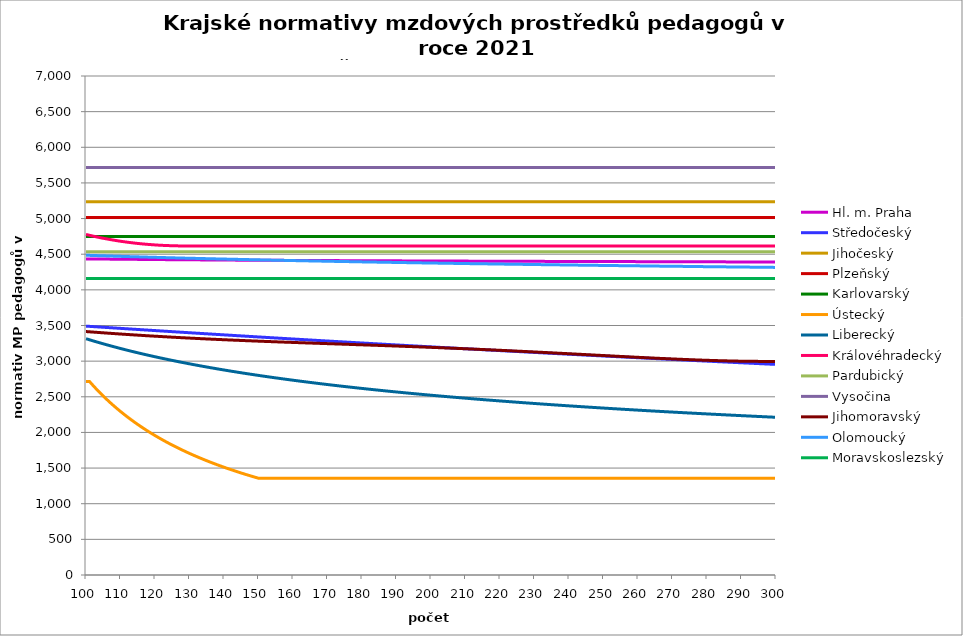
| Category | Hl. m. Praha | Středočeský | Jihočeský | Plzeňský | Karlovarský  | Ústecký   | Liberecký | Královéhradecký | Pardubický | Vysočina | Jihomoravský | Olomoucký | Moravskoslezský |
|---|---|---|---|---|---|---|---|---|---|---|---|---|---|
| 100.0 | 4434.066 | 3491.182 | 5236.605 | 5014.043 | 4750 | 2715.2 | 3314.841 | 4777.643 | 4533.328 | 5714.684 | 3415.264 | 4485.431 | 4159.138 |
| 101.0 | 4433.631 | 3488.011 | 5236.605 | 5014.043 | 4750 | 2715.2 | 3299.949 | 4765.772 | 4533.328 | 5714.684 | 3411.586 | 4483.979 | 4159.138 |
| 102.0 | 4433.196 | 3484.846 | 5236.605 | 5014.043 | 4750 | 2660.917 | 3285.335 | 4754.432 | 4533.328 | 5714.684 | 3407.915 | 4482.045 | 4159.138 |
| 103.0 | 4432.761 | 3481.686 | 5236.605 | 5014.043 | 4750 | 2608.762 | 3270.99 | 4743.615 | 4533.328 | 5714.684 | 3404.514 | 4480.595 | 4159.138 |
| 104.0 | 4432.326 | 3478.533 | 5236.605 | 5014.043 | 4750 | 2558.613 | 3256.907 | 4733.314 | 4533.328 | 5714.684 | 3400.859 | 4479.146 | 4159.138 |
| 105.0 | 4431.892 | 3475.385 | 5236.605 | 5014.043 | 4750 | 2510.355 | 3243.078 | 4723.522 | 4533.328 | 5714.684 | 3397.472 | 4477.699 | 4159.138 |
| 106.0 | 4431.457 | 3472.242 | 5236.605 | 5014.043 | 4750 | 2463.735 | 3229.495 | 4714.699 | 4533.328 | 5714.684 | 3393.832 | 4476.252 | 4159.138 |
| 107.0 | 4431.023 | 3469.106 | 5236.605 | 5014.043 | 4750 | 2418.958 | 3216.152 | 4705.908 | 4533.328 | 5714.684 | 3390.459 | 4474.806 | 4159.138 |
| 108.0 | 4430.588 | 3465.975 | 5236.605 | 5014.043 | 4750 | 2375.78 | 3203.041 | 4697.61 | 4533.328 | 5714.684 | 3387.092 | 4472.88 | 4159.138 |
| 109.0 | 4430.154 | 3462.849 | 5236.605 | 5014.043 | 4750 | 2334.117 | 3190.155 | 4689.341 | 4533.328 | 5714.684 | 3383.733 | 4471.436 | 4159.138 |
| 110.0 | 4429.72 | 3459.73 | 5236.605 | 5014.043 | 4750 | 2293.889 | 3177.489 | 4682.015 | 4533.328 | 5714.684 | 3380.38 | 4469.994 | 4159.138 |
| 111.0 | 4429.286 | 3456.616 | 5236.605 | 5014.043 | 4750 | 2255.025 | 3165.037 | 4675.168 | 4533.328 | 5714.684 | 3377.29 | 4468.552 | 4159.138 |
| 112.0 | 4428.851 | 3453.507 | 5236.605 | 5014.043 | 4750 | 2217.455 | 3152.792 | 4668.341 | 4533.328 | 5714.684 | 3373.95 | 4467.111 | 4159.138 |
| 113.0 | 4428.417 | 3450.404 | 5236.605 | 5014.043 | 4750 | 2181.117 | 3140.749 | 4662.44 | 4533.328 | 5714.684 | 3370.873 | 4465.671 | 4159.138 |
| 114.0 | 4427.984 | 3447.307 | 5236.605 | 5014.043 | 4750 | 2145.838 | 3128.903 | 4656.555 | 4533.328 | 5714.684 | 3367.801 | 4464.232 | 4159.138 |
| 115.0 | 4427.55 | 3444.215 | 5236.605 | 5014.043 | 4750 | 2111.791 | 3117.248 | 4651.135 | 4533.328 | 5714.684 | 3364.734 | 4463.273 | 4159.138 |
| 116.0 | 4427.116 | 3441.129 | 5236.605 | 5014.043 | 4750 | 2078.808 | 3105.78 | 4646.178 | 4533.328 | 5714.684 | 3361.674 | 4461.836 | 4159.138 |
| 117.0 | 4426.682 | 3438.048 | 5236.605 | 5014.043 | 4750 | 2046.839 | 3094.493 | 4641.68 | 4533.328 | 5714.684 | 3358.619 | 4460.399 | 4159.138 |
| 118.0 | 4426.249 | 3434.973 | 5236.605 | 5014.043 | 4750 | 2015.838 | 3083.382 | 4637.64 | 4533.328 | 5714.684 | 3355.569 | 4458.964 | 4159.138 |
| 119.0 | 4425.815 | 3431.903 | 5236.605 | 5014.043 | 4750 | 1985.763 | 3072.444 | 4634.055 | 4533.328 | 5714.684 | 3352.778 | 4457.529 | 4159.138 |
| 120.0 | 4425.382 | 3428.839 | 5236.605 | 5014.043 | 4750 | 1956.572 | 3061.674 | 4630.475 | 4533.328 | 5714.684 | 3349.992 | 4456.095 | 4159.138 |
| 121.0 | 4424.949 | 3425.781 | 5236.605 | 5014.043 | 4750 | 1928.226 | 3051.067 | 4627.347 | 4533.328 | 5714.684 | 3347.211 | 4455.14 | 4159.138 |
| 122.0 | 4424.515 | 3422.727 | 5236.605 | 5014.043 | 4750 | 1900.602 | 3040.62 | 4624.67 | 4533.328 | 5714.684 | 3344.434 | 4453.708 | 4159.138 |
| 123.0 | 4424.082 | 3419.679 | 5236.605 | 5014.043 | 4750 | 1873.844 | 3030.329 | 4622.441 | 4533.328 | 5714.684 | 3341.662 | 4452.276 | 4159.138 |
| 124.0 | 4424.082 | 3416.637 | 5236.605 | 5014.043 | 4750 | 1847.829 | 3020.19 | 4620.659 | 4533.328 | 5714.684 | 3338.895 | 4450.846 | 4159.138 |
| 125.0 | 4423.649 | 3413.6 | 5236.605 | 5014.043 | 4750 | 1822.527 | 3010.199 | 4618.879 | 4533.328 | 5714.684 | 3336.132 | 4449.893 | 4159.138 |
| 126.0 | 4423.216 | 3410.568 | 5236.605 | 5014.043 | 4750 | 1797.908 | 3000.352 | 4617.545 | 4533.328 | 5714.684 | 3333.624 | 4448.464 | 4159.138 |
| 127.0 | 4422.783 | 3407.542 | 5236.605 | 5014.043 | 4750 | 1773.945 | 2990.647 | 4616.655 | 4533.328 | 5714.684 | 3330.87 | 4447.036 | 4159.138 |
| 128.0 | 4422.351 | 3404.521 | 5236.605 | 5014.043 | 4750 | 1750.613 | 2981.08 | 4616.211 | 4533.328 | 5714.684 | 3328.37 | 4446.085 | 4159.138 |
| 129.0 | 4421.918 | 3401.506 | 5236.605 | 5014.043 | 4750 | 1727.886 | 2971.648 | 4615.767 | 4533.328 | 5714.684 | 3325.874 | 4444.658 | 4159.138 |
| 130.0 | 4421.485 | 3398.496 | 5236.605 | 5014.043 | 4750 | 1705.67 | 2962.347 | 4615.767 | 4533.328 | 5714.684 | 3323.381 | 4443.708 | 4159.138 |
| 131.0 | 4421.485 | 3395.491 | 5236.605 | 5014.043 | 4750 | 1684.089 | 2953.175 | 4615.767 | 4533.328 | 5714.684 | 3320.893 | 4442.283 | 4159.138 |
| 132.0 | 4421.053 | 3392.491 | 5236.605 | 5014.043 | 4750 | 1663.046 | 2944.129 | 4615.767 | 4533.328 | 5714.684 | 3318.656 | 4441.334 | 4159.138 |
| 133.0 | 4420.62 | 3389.497 | 5236.605 | 5014.043 | 4750 | 1642.523 | 2935.206 | 4615.767 | 4533.328 | 5714.684 | 3316.174 | 4439.91 | 4159.138 |
| 134.0 | 4420.188 | 3386.508 | 5236.605 | 5014.043 | 4750 | 1622.5 | 2926.402 | 4615.767 | 4533.328 | 5714.684 | 3313.944 | 4438.962 | 4159.138 |
| 135.0 | 4419.756 | 3383.524 | 5236.605 | 5014.043 | 4750 | 1602.96 | 2917.717 | 4615.767 | 4533.328 | 5714.684 | 3311.47 | 4437.54 | 4159.138 |
| 136.0 | 4419.756 | 3380.546 | 5236.605 | 5014.043 | 4750 | 1583.884 | 2909.146 | 4615.767 | 4533.328 | 5714.684 | 3309.246 | 4436.593 | 4159.138 |
| 137.0 | 4419.323 | 3377.573 | 5236.605 | 5014.043 | 4750 | 1565.257 | 2900.688 | 4615.767 | 4533.328 | 5714.684 | 3307.025 | 4435.172 | 4159.138 |
| 138.0 | 4418.891 | 3374.605 | 5236.605 | 5014.043 | 4750 | 1547.005 | 2892.339 | 4615.767 | 4533.328 | 5714.684 | 3304.807 | 4434.226 | 4159.138 |
| 139.0 | 4418.459 | 3371.642 | 5236.605 | 5014.043 | 4750 | 1529.231 | 2884.099 | 4615.767 | 4533.328 | 5714.684 | 3302.592 | 4432.807 | 4159.138 |
| 140.0 | 4418.027 | 3368.684 | 5236.605 | 5014.043 | 4750 | 1511.86 | 2875.963 | 4615.767 | 4533.328 | 5714.684 | 3300.625 | 4431.862 | 4159.138 |
| 141.0 | 4418.027 | 3365.732 | 5236.605 | 5014.043 | 4750 | 1494.88 | 2867.931 | 4615.767 | 4533.328 | 5714.684 | 3298.416 | 4430.917 | 4159.138 |
| 142.0 | 4417.595 | 3362.785 | 5236.605 | 5014.043 | 4750 | 1478.277 | 2860 | 4615.767 | 4533.328 | 5714.684 | 3296.209 | 4429.5 | 4159.138 |
| 143.0 | 4417.164 | 3359.843 | 5236.605 | 5014.043 | 4750 | 1462.038 | 2852.168 | 4615.767 | 4533.328 | 5714.684 | 3294.25 | 4428.556 | 4159.138 |
| 144.0 | 4416.732 | 3356.906 | 5236.605 | 5014.043 | 4750 | 1446.153 | 2844.433 | 4615.767 | 4533.328 | 5714.684 | 3292.294 | 4427.613 | 4159.138 |
| 145.0 | 4416.732 | 3353.974 | 5236.605 | 5014.043 | 4750 | 1430.609 | 2836.793 | 4615.767 | 4533.328 | 5714.684 | 3290.096 | 4426.198 | 4159.138 |
| 146.0 | 4416.3 | 3351.047 | 5236.605 | 5014.043 | 4750 | 1415.346 | 2829.246 | 4615.767 | 4533.328 | 5714.684 | 3288.144 | 4425.256 | 4159.138 |
| 147.0 | 4415.869 | 3348.126 | 5236.605 | 5014.043 | 4750 | 1400.454 | 2821.79 | 4615.767 | 4533.328 | 5714.684 | 3286.195 | 4424.313 | 4159.138 |
| 148.0 | 4415.437 | 3345.209 | 5236.605 | 5014.043 | 4750 | 1385.872 | 2814.423 | 4615.767 | 4533.328 | 5714.684 | 3284.248 | 4423.372 | 4159.138 |
| 149.0 | 4415.437 | 3342.298 | 5236.605 | 5014.043 | 4750 | 1371.59 | 2807.144 | 4615.767 | 4533.328 | 5714.684 | 3282.303 | 4421.96 | 4159.138 |
| 150.0 | 4415.006 | 3339.391 | 5236.605 | 5014.043 | 4750 | 1357.6 | 2799.951 | 4615.767 | 4533.328 | 5714.684 | 3280.361 | 4421.019 | 4159.138 |
| 151.0 | 4415.006 | 3336.49 | 5236.605 | 5014.043 | 4750 | 1357.6 | 2792.842 | 4615.767 | 4533.328 | 5714.684 | 3278.421 | 4420.079 | 4159.138 |
| 152.0 | 4414.575 | 3333.594 | 5236.605 | 5014.043 | 4750 | 1357.6 | 2785.815 | 4615.767 | 4533.328 | 5714.684 | 3276.725 | 4419.139 | 4159.138 |
| 153.0 | 4414.575 | 3330.703 | 5236.605 | 5014.043 | 4750 | 1357.6 | 2778.87 | 4615.767 | 4533.328 | 5714.684 | 3274.79 | 4417.73 | 4159.138 |
| 154.0 | 4414.143 | 3327.816 | 5236.605 | 5014.043 | 4750 | 1357.6 | 2772.004 | 4615.767 | 4533.328 | 5714.684 | 3273.098 | 4416.791 | 4159.138 |
| 155.0 | 4414.143 | 3324.935 | 5236.605 | 5014.043 | 4750 | 1357.6 | 2765.216 | 4615.767 | 4533.328 | 5714.684 | 3271.166 | 4415.852 | 4159.138 |
| 156.0 | 4413.712 | 3322.059 | 5236.605 | 5014.043 | 4750 | 1357.6 | 2758.504 | 4615.767 | 4533.328 | 5714.684 | 3269.478 | 4414.914 | 4159.138 |
| 157.0 | 4413.712 | 3319.188 | 5236.605 | 5014.043 | 4750 | 1357.6 | 2751.868 | 4615.767 | 4533.328 | 5714.684 | 3267.551 | 4413.976 | 4159.138 |
| 158.0 | 4413.281 | 3316.321 | 5236.605 | 5014.043 | 4750 | 1357.6 | 2745.305 | 4615.767 | 4533.328 | 5714.684 | 3265.866 | 4413.039 | 4159.138 |
| 159.0 | 4413.281 | 3313.46 | 5236.605 | 5014.043 | 4750 | 1357.6 | 2738.815 | 4615.767 | 4533.328 | 5714.684 | 3264.184 | 4412.102 | 4159.138 |
| 160.0 | 4412.85 | 3310.603 | 5236.605 | 5014.043 | 4750 | 1357.6 | 2732.395 | 4615.767 | 4533.328 | 5714.684 | 3262.263 | 4411.165 | 4159.138 |
| 161.0 | 4412.85 | 3307.752 | 5236.605 | 5014.043 | 4750 | 1357.6 | 2726.046 | 4615.767 | 4533.328 | 5714.684 | 3260.584 | 4409.761 | 4159.138 |
| 162.0 | 4412.419 | 3304.905 | 5236.605 | 5014.043 | 4750 | 1357.6 | 2719.764 | 4615.767 | 4533.328 | 5714.684 | 3258.907 | 4408.826 | 4159.138 |
| 163.0 | 4412.419 | 3302.064 | 5236.605 | 5014.043 | 4750 | 1357.6 | 2713.55 | 4615.767 | 4533.328 | 5714.684 | 3257.231 | 4407.891 | 4159.138 |
| 164.0 | 4411.989 | 3299.227 | 5236.605 | 5014.043 | 4750 | 1357.6 | 2707.403 | 4615.767 | 4533.328 | 5714.684 | 3255.557 | 4406.956 | 4159.138 |
| 165.0 | 4411.989 | 3296.395 | 5236.605 | 5014.043 | 4750 | 1357.6 | 2701.32 | 4615.767 | 4533.328 | 5714.684 | 3253.885 | 4406.021 | 4159.138 |
| 166.0 | 4411.558 | 3293.568 | 5236.605 | 5014.043 | 4750 | 1357.6 | 2695.301 | 4615.767 | 4533.328 | 5714.684 | 3252.215 | 4405.087 | 4159.138 |
| 167.0 | 4411.558 | 3290.746 | 5236.605 | 5014.043 | 4750 | 1357.6 | 2689.344 | 4615.767 | 4533.328 | 5714.684 | 3250.546 | 4404.154 | 4159.138 |
| 168.0 | 4411.127 | 3287.928 | 5236.605 | 5014.043 | 4750 | 1357.6 | 2683.449 | 4615.767 | 4533.328 | 5714.684 | 3248.879 | 4403.221 | 4159.138 |
| 169.0 | 4411.127 | 3285.115 | 5236.605 | 5014.043 | 4750 | 1357.6 | 2677.615 | 4615.767 | 4533.328 | 5714.684 | 3247.214 | 4402.288 | 4159.138 |
| 170.0 | 4410.697 | 3282.308 | 5236.605 | 5014.043 | 4750 | 1357.6 | 2671.84 | 4615.767 | 4533.328 | 5714.684 | 3245.55 | 4401.356 | 4159.138 |
| 171.0 | 4410.697 | 3279.505 | 5236.605 | 5014.043 | 4750 | 1357.6 | 2666.124 | 4615.767 | 4533.328 | 5714.684 | 3243.889 | 4400.424 | 4159.138 |
| 172.0 | 4410.266 | 3276.706 | 5236.605 | 5014.043 | 4750 | 1357.6 | 2660.465 | 4615.767 | 4533.328 | 5714.684 | 3242.228 | 4399.492 | 4159.138 |
| 173.0 | 4410.266 | 3273.913 | 5236.605 | 5014.043 | 4750 | 1357.6 | 2654.863 | 4615.767 | 4533.328 | 5714.684 | 3240.57 | 4399.026 | 4159.138 |
| 174.0 | 4409.836 | 3271.124 | 5236.605 | 5014.043 | 4750 | 1357.6 | 2649.316 | 4615.767 | 4533.328 | 5714.684 | 3238.913 | 4398.095 | 4159.138 |
| 175.0 | 4409.836 | 3268.34 | 5236.605 | 5014.043 | 4750 | 1357.6 | 2643.824 | 4615.767 | 4533.328 | 5714.684 | 3237.258 | 4397.165 | 4159.138 |
| 176.0 | 4409.406 | 3265.561 | 5236.605 | 5014.043 | 4750 | 1357.6 | 2638.386 | 4615.767 | 4533.328 | 5714.684 | 3235.605 | 4396.234 | 4159.138 |
| 177.0 | 4409.406 | 3262.787 | 5236.605 | 5014.043 | 4750 | 1357.6 | 2633.001 | 4615.767 | 4533.328 | 5714.684 | 3233.717 | 4395.305 | 4159.138 |
| 178.0 | 4408.976 | 3260.017 | 5236.605 | 5014.043 | 4750 | 1357.6 | 2627.668 | 4615.767 | 4533.328 | 5714.684 | 3232.068 | 4394.375 | 4159.138 |
| 179.0 | 4408.976 | 3257.252 | 5236.605 | 5014.043 | 4750 | 1357.6 | 2622.386 | 4615.767 | 4533.328 | 5714.684 | 3230.42 | 4393.446 | 4159.138 |
| 180.0 | 4408.546 | 3254.492 | 5236.605 | 5014.043 | 4750 | 1357.6 | 2617.155 | 4615.767 | 4533.328 | 5714.684 | 3228.773 | 4392.517 | 4159.138 |
| 181.0 | 4408.546 | 3251.736 | 5236.605 | 5014.043 | 4750 | 1357.6 | 2611.973 | 4615.767 | 4533.328 | 5714.684 | 3227.129 | 4391.589 | 4159.138 |
| 182.0 | 4408.546 | 3248.985 | 5236.605 | 5014.043 | 4750 | 1357.6 | 2606.841 | 4615.767 | 4533.328 | 5714.684 | 3225.485 | 4391.125 | 4159.138 |
| 183.0 | 4408.115 | 3246.238 | 5236.605 | 5014.043 | 4750 | 1357.6 | 2601.756 | 4615.767 | 4533.328 | 5714.684 | 3223.844 | 4390.198 | 4159.138 |
| 184.0 | 4408.115 | 3243.497 | 5236.605 | 5014.043 | 4750 | 1357.6 | 2596.718 | 4615.767 | 4533.328 | 5714.684 | 3222.204 | 4389.27 | 4159.138 |
| 185.0 | 4407.686 | 3240.759 | 5236.605 | 5014.043 | 4750 | 1357.6 | 2591.728 | 4615.767 | 4533.328 | 5714.684 | 3220.333 | 4388.343 | 4159.138 |
| 186.0 | 4407.686 | 3238.027 | 5236.605 | 5014.043 | 4750 | 1357.6 | 2586.783 | 4615.767 | 4533.328 | 5714.684 | 3218.696 | 4387.417 | 4159.138 |
| 187.0 | 4407.256 | 3235.299 | 5236.605 | 5014.043 | 4750 | 1357.6 | 2581.883 | 4615.767 | 4533.328 | 5714.684 | 3217.062 | 4386.954 | 4159.138 |
| 188.0 | 4407.256 | 3232.576 | 5236.605 | 5014.043 | 4750 | 1357.6 | 2577.028 | 4615.767 | 4533.328 | 5714.684 | 3215.196 | 4386.028 | 4159.138 |
| 189.0 | 4406.826 | 3229.857 | 5236.605 | 5014.043 | 4750 | 1357.6 | 2572.217 | 4615.767 | 4533.328 | 5714.684 | 3213.565 | 4385.102 | 4159.138 |
| 190.0 | 4406.826 | 3227.143 | 5236.605 | 5014.043 | 4750 | 1357.6 | 2567.449 | 4615.767 | 4533.328 | 5714.684 | 3211.703 | 4384.177 | 4159.138 |
| 191.0 | 4406.826 | 3224.433 | 5236.605 | 5014.043 | 4750 | 1357.6 | 2562.723 | 4615.767 | 4533.328 | 5714.684 | 3210.076 | 4383.715 | 4159.138 |
| 192.0 | 4406.396 | 3221.728 | 5236.605 | 5014.043 | 4750 | 1357.6 | 2558.039 | 4615.767 | 4533.328 | 5714.684 | 3208.218 | 4382.79 | 4159.138 |
| 193.0 | 4406.396 | 3219.028 | 5236.605 | 5014.043 | 4750 | 1357.6 | 2553.397 | 4615.767 | 4533.328 | 5714.684 | 3206.363 | 4381.866 | 4159.138 |
| 194.0 | 4405.967 | 3216.332 | 5236.605 | 5014.043 | 4750 | 1357.6 | 2548.795 | 4615.767 | 4533.328 | 5714.684 | 3204.741 | 4380.942 | 4159.138 |
| 195.0 | 4405.967 | 3213.64 | 5236.605 | 5014.043 | 4750 | 1357.6 | 2544.233 | 4615.767 | 4533.328 | 5714.684 | 3202.889 | 4380.481 | 4159.138 |
| 196.0 | 4405.537 | 3210.953 | 5236.605 | 5014.043 | 4750 | 1357.6 | 2539.711 | 4615.767 | 4533.328 | 5714.684 | 3201.039 | 4379.557 | 4159.138 |
| 197.0 | 4405.537 | 3208.271 | 5236.605 | 5014.043 | 4750 | 1357.6 | 2535.228 | 4615.767 | 4533.328 | 5714.684 | 3199.192 | 4378.635 | 4159.138 |
| 198.0 | 4405.537 | 3205.593 | 5236.605 | 5014.043 | 4750 | 1357.6 | 2530.783 | 4615.767 | 4533.328 | 5714.684 | 3197.347 | 4378.173 | 4159.138 |
| 199.0 | 4405.108 | 3202.919 | 5236.605 | 5014.043 | 4750 | 1357.6 | 2526.376 | 4615.767 | 4533.328 | 5714.684 | 3195.504 | 4377.251 | 4159.138 |
| 200.0 | 4405.108 | 3200.25 | 5236.605 | 5014.043 | 4750 | 1357.6 | 2522.007 | 4615.767 | 4533.328 | 5714.684 | 3193.663 | 4376.329 | 4159.138 |
| 201.0 | 4404.678 | 3197.585 | 5236.605 | 5014.043 | 4750 | 1357.6 | 2517.674 | 4615.767 | 4533.328 | 5714.684 | 3191.594 | 4375.869 | 4159.138 |
| 202.0 | 4404.678 | 3194.925 | 5236.605 | 5014.043 | 4750 | 1357.6 | 2513.377 | 4615.767 | 4533.328 | 5714.684 | 3189.758 | 4374.947 | 4159.138 |
| 203.0 | 4404.678 | 3192.269 | 5236.605 | 5014.043 | 4750 | 1357.6 | 2509.116 | 4615.767 | 4533.328 | 5714.684 | 3187.694 | 4374.027 | 4159.138 |
| 204.0 | 4404.249 | 3189.618 | 5236.605 | 5014.043 | 4750 | 1357.6 | 2504.89 | 4615.767 | 4533.328 | 5714.684 | 3185.862 | 4373.566 | 4159.138 |
| 205.0 | 4404.249 | 3186.971 | 5236.605 | 5014.043 | 4750 | 1357.6 | 2500.7 | 4615.767 | 4533.328 | 5714.684 | 3183.804 | 4372.646 | 4159.138 |
| 206.0 | 4403.82 | 3184.328 | 5236.605 | 5014.043 | 4750 | 1357.6 | 2496.543 | 4615.767 | 4533.328 | 5714.684 | 3181.976 | 4371.726 | 4159.138 |
| 207.0 | 4403.82 | 3181.69 | 5236.605 | 5014.043 | 4750 | 1357.6 | 2492.42 | 4615.767 | 4533.328 | 5714.684 | 3179.923 | 4371.266 | 4159.138 |
| 208.0 | 4403.82 | 3179.056 | 5236.605 | 5014.043 | 4750 | 1357.6 | 2488.331 | 4615.767 | 4533.328 | 5714.684 | 3177.872 | 4370.347 | 4159.138 |
| 209.0 | 4403.391 | 3176.427 | 5236.605 | 5014.043 | 4750 | 1357.6 | 2484.274 | 4615.767 | 4533.328 | 5714.684 | 3175.824 | 4369.887 | 4159.138 |
| 210.0 | 4403.391 | 3173.802 | 5236.605 | 5014.043 | 4750 | 1357.6 | 2480.25 | 4615.767 | 4533.328 | 5714.684 | 3173.778 | 4368.969 | 4159.138 |
| 211.0 | 4402.962 | 3171.181 | 5236.605 | 5014.043 | 4750 | 1357.6 | 2476.258 | 4615.767 | 4533.328 | 5714.684 | 3171.735 | 4368.05 | 4159.138 |
| 212.0 | 4402.962 | 3168.564 | 5236.605 | 5014.043 | 4750 | 1357.6 | 2472.298 | 4615.767 | 4533.328 | 5714.684 | 3169.468 | 4367.591 | 4159.138 |
| 213.0 | 4402.962 | 3165.952 | 5236.605 | 5014.043 | 4750 | 1357.6 | 2468.369 | 4615.767 | 4533.328 | 5714.684 | 3167.431 | 4366.674 | 4159.138 |
| 214.0 | 4402.533 | 3163.344 | 5236.605 | 5014.043 | 4750 | 1357.6 | 2464.47 | 4615.767 | 4533.328 | 5714.684 | 3165.396 | 4366.215 | 4159.138 |
| 215.0 | 4402.533 | 3160.741 | 5236.605 | 5014.043 | 4750 | 1357.6 | 2460.602 | 4615.767 | 4533.328 | 5714.684 | 3163.138 | 4365.298 | 4159.138 |
| 216.0 | 4402.104 | 3158.141 | 5236.605 | 5014.043 | 4750 | 1357.6 | 2456.764 | 4615.767 | 4533.328 | 5714.684 | 3160.884 | 4364.839 | 4159.138 |
| 217.0 | 4402.104 | 3155.546 | 5236.605 | 5014.043 | 4750 | 1357.6 | 2452.956 | 4615.767 | 4533.328 | 5714.684 | 3158.857 | 4363.923 | 4159.138 |
| 218.0 | 4402.104 | 3152.956 | 5236.605 | 5014.043 | 4750 | 1357.6 | 2449.177 | 4615.767 | 4533.328 | 5714.684 | 3156.609 | 4363.465 | 4159.138 |
| 219.0 | 4401.675 | 3150.369 | 5236.605 | 5014.043 | 4750 | 1357.6 | 2445.426 | 4615.767 | 4533.328 | 5714.684 | 3154.364 | 4362.549 | 4159.138 |
| 220.0 | 4401.675 | 3147.787 | 5236.605 | 5014.043 | 4750 | 1357.6 | 2441.705 | 4615.767 | 4533.328 | 5714.684 | 3152.122 | 4361.633 | 4159.138 |
| 221.0 | 4401.675 | 3145.209 | 5236.605 | 5014.043 | 4750 | 1357.6 | 2438.011 | 4615.767 | 4533.328 | 5714.684 | 3149.883 | 4361.175 | 4159.138 |
| 222.0 | 4401.247 | 3142.635 | 5236.605 | 5014.043 | 4750 | 1357.6 | 2434.345 | 4615.767 | 4533.328 | 5714.684 | 3147.647 | 4360.26 | 4159.138 |
| 223.0 | 4401.247 | 3140.065 | 5236.605 | 5014.043 | 4750 | 1357.6 | 2430.706 | 4615.767 | 4533.328 | 5714.684 | 3145.191 | 4359.803 | 4159.138 |
| 224.0 | 4400.818 | 3137.5 | 5236.605 | 5014.043 | 4750 | 1357.6 | 2427.095 | 4615.767 | 4533.328 | 5714.684 | 3142.962 | 4358.888 | 4159.138 |
| 225.0 | 4400.818 | 3134.939 | 5236.605 | 5014.043 | 4750 | 1357.6 | 2423.51 | 4615.767 | 4533.328 | 5714.684 | 3140.514 | 4358.431 | 4159.138 |
| 226.0 | 4400.818 | 3132.382 | 5236.605 | 5014.043 | 4750 | 1357.6 | 2419.951 | 4615.767 | 4533.328 | 5714.684 | 3138.292 | 4357.974 | 4159.138 |
| 227.0 | 4400.389 | 3129.829 | 5236.605 | 5014.043 | 4750 | 1357.6 | 2416.419 | 4615.767 | 4533.328 | 5714.684 | 3135.851 | 4357.06 | 4159.138 |
| 228.0 | 4400.389 | 3127.28 | 5236.605 | 5014.043 | 4750 | 1357.6 | 2412.913 | 4615.767 | 4533.328 | 5714.684 | 3133.413 | 4356.604 | 4159.138 |
| 229.0 | 4400.389 | 3124.736 | 5236.605 | 5014.043 | 4750 | 1357.6 | 2409.431 | 4615.767 | 4533.328 | 5714.684 | 3131.201 | 4355.691 | 4159.138 |
| 230.0 | 4399.961 | 3122.195 | 5236.605 | 5014.043 | 4750 | 1357.6 | 2405.975 | 4615.767 | 4533.328 | 5714.684 | 3128.771 | 4355.234 | 4159.138 |
| 231.0 | 4399.961 | 3119.659 | 5236.605 | 5014.043 | 4750 | 1357.6 | 2402.544 | 4615.767 | 4533.328 | 5714.684 | 3126.345 | 4354.322 | 4159.138 |
| 232.0 | 4399.961 | 3117.127 | 5236.605 | 5014.043 | 4750 | 1357.6 | 2399.138 | 4615.767 | 4533.328 | 5714.684 | 3123.922 | 4353.865 | 4159.138 |
| 233.0 | 4399.533 | 3114.599 | 5236.605 | 5014.043 | 4750 | 1357.6 | 2395.755 | 4615.767 | 4533.328 | 5714.684 | 3121.503 | 4352.953 | 4159.138 |
| 234.0 | 4399.533 | 3112.075 | 5236.605 | 5014.043 | 4750 | 1357.6 | 2392.397 | 4615.767 | 4533.328 | 5714.684 | 3118.869 | 4352.498 | 4159.138 |
| 235.0 | 4399.533 | 3109.555 | 5236.605 | 5014.043 | 4750 | 1357.6 | 2389.062 | 4615.767 | 4533.328 | 5714.684 | 3116.458 | 4352.042 | 4159.138 |
| 236.0 | 4399.104 | 3107.039 | 5236.605 | 5014.043 | 4750 | 1357.6 | 2385.751 | 4615.767 | 4533.328 | 5714.684 | 3114.051 | 4351.131 | 4159.138 |
| 237.0 | 4399.104 | 3104.527 | 5236.605 | 5014.043 | 4750 | 1357.6 | 2382.462 | 4615.767 | 4533.328 | 5714.684 | 3111.429 | 4350.675 | 4159.138 |
| 238.0 | 4398.676 | 3102.019 | 5236.605 | 5014.043 | 4750 | 1357.6 | 2379.197 | 4615.767 | 4533.328 | 5714.684 | 3109.03 | 4349.765 | 4159.138 |
| 239.0 | 4398.676 | 3099.516 | 5236.605 | 5014.043 | 4750 | 1357.6 | 2375.954 | 4615.767 | 4533.328 | 5714.684 | 3106.416 | 4349.309 | 4159.138 |
| 240.0 | 4398.676 | 3097.016 | 5236.605 | 5014.043 | 4750 | 1357.6 | 2372.734 | 4615.767 | 4533.328 | 5714.684 | 3104.025 | 4348.399 | 4159.138 |
| 241.0 | 4398.248 | 3094.521 | 5236.605 | 5014.043 | 4750 | 1357.6 | 2369.535 | 4615.767 | 4533.328 | 5714.684 | 3101.42 | 4347.944 | 4159.138 |
| 242.0 | 4398.248 | 3092.029 | 5236.605 | 5014.043 | 4750 | 1357.6 | 2366.358 | 4615.767 | 4533.328 | 5714.684 | 3098.819 | 4347.49 | 4159.138 |
| 243.0 | 4398.248 | 3089.541 | 5236.605 | 5014.043 | 4750 | 1357.6 | 2363.203 | 4615.767 | 4533.328 | 5714.684 | 3096.439 | 4346.58 | 4159.138 |
| 244.0 | 4397.82 | 3087.058 | 5236.605 | 5014.043 | 4750 | 1357.6 | 2360.069 | 4615.767 | 4533.328 | 5714.684 | 3093.847 | 4346.126 | 4159.138 |
| 245.0 | 4397.82 | 3084.578 | 5236.605 | 5014.043 | 4750 | 1357.6 | 2356.957 | 4615.767 | 4533.328 | 5714.684 | 3091.259 | 4345.671 | 4159.138 |
| 246.0 | 4397.82 | 3082.103 | 5236.605 | 5014.043 | 4750 | 1357.6 | 2353.865 | 4615.767 | 4533.328 | 5714.684 | 3088.675 | 4344.763 | 4159.138 |
| 247.0 | 4397.392 | 3079.631 | 5236.605 | 5014.043 | 4750 | 1357.6 | 2350.793 | 4615.767 | 4533.328 | 5714.684 | 3086.096 | 4344.309 | 4159.138 |
| 248.0 | 4397.392 | 3077.163 | 5236.605 | 5014.043 | 4750 | 1357.6 | 2347.742 | 4615.767 | 4533.328 | 5714.684 | 3083.521 | 4343.855 | 4159.138 |
| 249.0 | 4397.392 | 3074.7 | 5236.605 | 5014.043 | 4750 | 1357.6 | 2344.712 | 4615.767 | 4533.328 | 5714.684 | 3081.164 | 4342.947 | 4159.138 |
| 250.0 | 4396.964 | 3072.24 | 5236.605 | 5014.043 | 4750 | 1357.6 | 2341.701 | 4615.767 | 4533.328 | 5714.684 | 3078.598 | 4342.493 | 4159.138 |
| 251.0 | 4396.964 | 3069.784 | 5236.605 | 5014.043 | 4750 | 1357.6 | 2338.709 | 4615.767 | 4533.328 | 5714.684 | 3076.035 | 4342.039 | 4159.138 |
| 252.0 | 4396.964 | 3067.332 | 5236.605 | 5014.043 | 4750 | 1357.6 | 2335.738 | 4615.767 | 4533.328 | 5714.684 | 3073.477 | 4341.132 | 4159.138 |
| 253.0 | 4396.537 | 3064.884 | 5236.605 | 5014.043 | 4750 | 1357.6 | 2332.785 | 4615.767 | 4533.328 | 5714.684 | 3070.923 | 4340.679 | 4159.138 |
| 254.0 | 4396.537 | 3062.44 | 5236.605 | 5014.043 | 4750 | 1357.6 | 2329.852 | 4615.767 | 4533.328 | 5714.684 | 3068.373 | 4340.226 | 4159.138 |
| 255.0 | 4396.537 | 3060 | 5236.605 | 5014.043 | 4750 | 1357.6 | 2326.937 | 4615.767 | 4533.328 | 5714.684 | 3066.04 | 4339.319 | 4159.138 |
| 256.0 | 4396.109 | 3057.564 | 5236.605 | 5014.043 | 4750 | 1357.6 | 2324.041 | 4615.767 | 4533.328 | 5714.684 | 3063.498 | 4338.866 | 4159.138 |
| 257.0 | 4396.109 | 3055.131 | 5236.605 | 5014.043 | 4750 | 1357.6 | 2321.164 | 4615.767 | 4533.328 | 5714.684 | 3060.961 | 4338.413 | 4159.138 |
| 258.0 | 4396.109 | 3052.703 | 5236.605 | 5014.043 | 4750 | 1357.6 | 2318.305 | 4615.767 | 4533.328 | 5714.684 | 3058.428 | 4337.508 | 4159.138 |
| 259.0 | 4396.109 | 3050.278 | 5236.605 | 5014.043 | 4750 | 1357.6 | 2315.463 | 4615.767 | 4533.328 | 5714.684 | 3056.109 | 4337.055 | 4159.138 |
| 260.0 | 4395.681 | 3047.857 | 5236.605 | 5014.043 | 4750 | 1357.6 | 2312.64 | 4615.767 | 4533.328 | 5714.684 | 3053.584 | 4336.603 | 4159.138 |
| 261.0 | 4395.681 | 3045.44 | 5236.605 | 5014.043 | 4750 | 1357.6 | 2309.834 | 4615.767 | 4533.328 | 5714.684 | 3051.273 | 4336.15 | 4159.138 |
| 262.0 | 4395.681 | 3043.027 | 5236.605 | 5014.043 | 4750 | 1357.6 | 2307.046 | 4615.767 | 4533.328 | 5714.684 | 3048.756 | 4335.246 | 4159.138 |
| 263.0 | 4395.254 | 3040.618 | 5236.605 | 5014.043 | 4750 | 1357.6 | 2304.276 | 4615.767 | 4533.328 | 5714.684 | 3046.452 | 4334.793 | 4159.138 |
| 264.0 | 4395.254 | 3038.212 | 5236.605 | 5014.043 | 4750 | 1357.6 | 2301.522 | 4615.767 | 4533.328 | 5714.684 | 3044.152 | 4334.341 | 4159.138 |
| 265.0 | 4395.254 | 3035.81 | 5236.605 | 5014.043 | 4750 | 1357.6 | 2298.785 | 4615.767 | 4533.328 | 5714.684 | 3041.855 | 4333.438 | 4159.138 |
| 266.0 | 4394.826 | 3033.412 | 5236.605 | 5014.043 | 4750 | 1357.6 | 2296.065 | 4615.767 | 4533.328 | 5714.684 | 3039.561 | 4332.986 | 4159.138 |
| 267.0 | 4394.826 | 3031.018 | 5236.605 | 5014.043 | 4750 | 1357.6 | 2293.362 | 4615.767 | 4533.328 | 5714.684 | 3037.271 | 4332.534 | 4159.138 |
| 268.0 | 4394.826 | 3028.628 | 5236.605 | 5014.043 | 4750 | 1357.6 | 2290.675 | 4615.767 | 4533.328 | 5714.684 | 3035.193 | 4332.083 | 4159.138 |
| 269.0 | 4394.399 | 3026.241 | 5236.605 | 5014.043 | 4750 | 1357.6 | 2288.004 | 4615.767 | 4533.328 | 5714.684 | 3032.909 | 4331.631 | 4159.138 |
| 270.0 | 4394.399 | 3023.858 | 5236.605 | 5014.043 | 4750 | 1357.6 | 2285.349 | 4615.767 | 4533.328 | 5714.684 | 3030.837 | 4330.728 | 4159.138 |
| 271.0 | 4394.399 | 3021.479 | 5236.605 | 5014.043 | 4750 | 1357.6 | 2282.711 | 4615.767 | 4533.328 | 5714.684 | 3028.767 | 4330.277 | 4159.138 |
| 272.0 | 4393.972 | 3019.104 | 5236.605 | 5014.043 | 4750 | 1357.6 | 2280.088 | 4615.767 | 4533.328 | 5714.684 | 3026.699 | 4329.826 | 4159.138 |
| 273.0 | 4393.972 | 3016.732 | 5236.605 | 5014.043 | 4750 | 1357.6 | 2277.481 | 4615.767 | 4533.328 | 5714.684 | 3024.635 | 4329.375 | 4159.138 |
| 274.0 | 4393.972 | 3014.364 | 5236.605 | 5014.043 | 4750 | 1357.6 | 2274.889 | 4615.767 | 4533.328 | 5714.684 | 3022.574 | 4328.473 | 4159.138 |
| 275.0 | 4393.972 | 3012 | 5236.605 | 5014.043 | 4750 | 1357.6 | 2272.312 | 4615.767 | 4533.328 | 5714.684 | 3020.721 | 4328.022 | 4159.138 |
| 276.0 | 4393.545 | 3009.639 | 5236.605 | 5014.043 | 4750 | 1357.6 | 2269.751 | 4615.767 | 4533.328 | 5714.684 | 3018.87 | 4327.572 | 4159.138 |
| 277.0 | 4393.545 | 3007.283 | 5236.605 | 5014.043 | 4750 | 1357.6 | 2267.204 | 4615.767 | 4533.328 | 5714.684 | 3017.022 | 4327.121 | 4159.138 |
| 278.0 | 4393.545 | 3004.93 | 5236.605 | 5014.043 | 4750 | 1357.6 | 2264.673 | 4615.767 | 4533.328 | 5714.684 | 3015.175 | 4326.671 | 4159.138 |
| 279.0 | 4393.118 | 3002.58 | 5236.605 | 5014.043 | 4750 | 1357.6 | 2262.156 | 4615.767 | 4533.328 | 5714.684 | 3013.536 | 4325.77 | 4159.138 |
| 280.0 | 4393.118 | 3000.234 | 5236.605 | 5014.043 | 4750 | 1357.6 | 2259.654 | 4615.767 | 4533.328 | 5714.684 | 3011.899 | 4325.32 | 4159.138 |
| 281.0 | 4393.118 | 2997.892 | 5236.605 | 5014.043 | 4750 | 1357.6 | 2257.166 | 4615.767 | 4533.328 | 5714.684 | 3010.263 | 4324.87 | 4159.138 |
| 282.0 | 4393.118 | 2995.554 | 5236.605 | 5014.043 | 4750 | 1357.6 | 2254.692 | 4615.767 | 4533.328 | 5714.684 | 3008.834 | 4324.42 | 4159.138 |
| 283.0 | 4392.691 | 2993.219 | 5236.605 | 5014.043 | 4750 | 1357.6 | 2252.233 | 4615.767 | 4533.328 | 5714.684 | 3007.405 | 4323.97 | 4159.138 |
| 284.0 | 4392.691 | 2990.888 | 5236.605 | 5014.043 | 4750 | 1357.6 | 2249.788 | 4615.767 | 4533.328 | 5714.684 | 3005.978 | 4323.071 | 4159.138 |
| 285.0 | 4392.691 | 2988.56 | 5236.605 | 5014.043 | 4750 | 1357.6 | 2247.356 | 4615.767 | 4533.328 | 5714.684 | 3004.756 | 4322.621 | 4159.138 |
| 286.0 | 4392.264 | 2986.236 | 5236.605 | 5014.043 | 4750 | 1357.6 | 2244.938 | 4615.767 | 4533.328 | 5714.684 | 3003.535 | 4322.171 | 4159.138 |
| 287.0 | 4392.264 | 2983.916 | 5236.605 | 5014.043 | 4750 | 1357.6 | 2242.534 | 4615.767 | 4533.328 | 5714.684 | 3002.315 | 4321.722 | 4159.138 |
| 288.0 | 4392.264 | 2981.599 | 5236.605 | 5014.043 | 4750 | 1357.6 | 2240.143 | 4615.767 | 4533.328 | 5714.684 | 3001.299 | 4321.273 | 4159.138 |
| 289.0 | 4391.837 | 2979.286 | 5236.605 | 5014.043 | 4750 | 1357.6 | 2237.766 | 4615.767 | 4533.328 | 5714.684 | 3000.284 | 4320.823 | 4159.138 |
| 290.0 | 4391.837 | 2976.977 | 5236.605 | 5014.043 | 4750 | 1357.6 | 2235.402 | 4615.767 | 4533.328 | 5714.684 | 2999.472 | 4319.925 | 4159.138 |
| 291.0 | 4391.837 | 2974.671 | 5236.605 | 5014.043 | 4750 | 1357.6 | 2233.051 | 4615.767 | 4533.328 | 5714.684 | 2998.661 | 4319.476 | 4159.138 |
| 292.0 | 4391.837 | 2972.368 | 5236.605 | 5014.043 | 4750 | 1357.6 | 2230.713 | 4615.767 | 4533.328 | 5714.684 | 2998.053 | 4319.027 | 4159.138 |
| 293.0 | 4391.41 | 2970.07 | 5236.605 | 5014.043 | 4750 | 1357.6 | 2228.388 | 4615.767 | 4533.328 | 5714.684 | 2997.445 | 4318.579 | 4159.138 |
| 294.0 | 4391.41 | 2967.774 | 5236.605 | 5014.043 | 4750 | 1357.6 | 2226.075 | 4615.767 | 4533.328 | 5714.684 | 2997.04 | 4318.13 | 4159.138 |
| 295.0 | 4391.41 | 2965.483 | 5236.605 | 5014.043 | 4750 | 1357.6 | 2223.775 | 4615.767 | 4533.328 | 5714.684 | 2996.635 | 4317.681 | 4159.138 |
| 296.0 | 4391.41 | 2963.194 | 5236.605 | 5014.043 | 4750 | 1357.6 | 2221.488 | 4615.767 | 4533.328 | 5714.684 | 2996.432 | 4317.233 | 4159.138 |
| 297.0 | 4390.983 | 2960.91 | 5236.605 | 5014.043 | 4750 | 1357.6 | 2219.213 | 4615.767 | 4533.328 | 5714.684 | 2996.23 | 4316.784 | 4159.138 |
| 298.0 | 4390.983 | 2958.629 | 5236.605 | 5014.043 | 4750 | 1357.6 | 2216.951 | 4615.767 | 4533.328 | 5714.684 | 2996.23 | 4315.888 | 4159.138 |
| 299.0 | 4390.983 | 2956.351 | 5236.605 | 5014.043 | 4750 | 1357.6 | 2214.7 | 4615.767 | 4533.328 | 5714.684 | 2996.23 | 4315.44 | 4159.138 |
| 300.0 | 4390.557 | 2954.077 | 5236.605 | 5014.043 | 4750 | 1357.6 | 2212.462 | 4615.767 | 4533.328 | 5714.684 | 2996.23 | 4314.992 | 4159.138 |